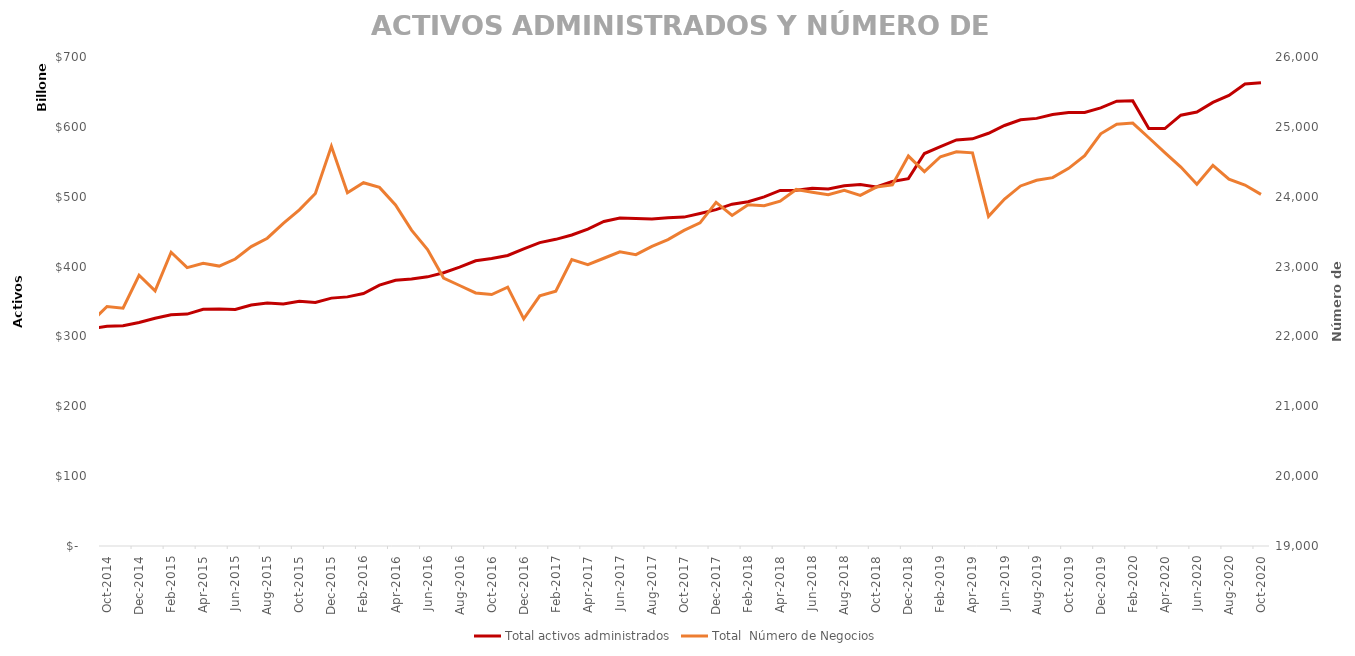
| Category | Total activos administrados |
|---|---|
| 2014-01-01 | 275831100.32 |
| 2014-02-01 | 282540287.38 |
| 2014-03-01 | 293725410.34 |
| 2014-04-01 | 297083130.06 |
| 2014-05-01 | 299989040.55 |
| 2014-06-01 | 299856845.58 |
| 2014-07-01 | 304100994.88 |
| 2014-08-01 | 315107203.45 |
| 2014-09-01 | 310941517.35 |
| 2014-10-01 | 314517386.46 |
| 2014-11-01 | 315319470.57 |
| 2014-12-01 | 320028520.24 |
| 2015-01-01 | 326117158.47 |
| 2015-02-01 | 331144520.36 |
| 2015-03-01 | 331981172.805 |
| 2015-04-01 | 338926238.767 |
| 2015-05-01 | 339240079.978 |
| 2015-06-01 | 338507344.528 |
| 2015-07-01 | 344906623.679 |
| 2015-08-01 | 347934876.102 |
| 2015-09-01 | 346437581.721 |
| 2015-10-01 | 350288175.716 |
| 2015-11-01 | 348695859.246 |
| 2015-12-01 | 354836337.141 |
| 2016-01-01 | 356608868.945 |
| 2016-02-01 | 361371487.01 |
| 2016-03-01 | 373359908.982 |
| 2016-04-01 | 380293748.088 |
| 2016-05-01 | 382057296.776 |
| 2016-06-01 | 385284005.51 |
| 2016-07-01 | 391162222.786 |
| 2016-08-01 | 399100246.403 |
| 2016-09-01 | 408243528.619 |
| 2016-10-01 | 411681112.939 |
| 2016-11-01 | 415877569.787 |
| 2016-12-01 | 425216779.143 |
| 2017-01-01 | 434258404.05 |
| 2017-02-01 | 438987856.756 |
| 2017-03-01 | 445157660.961 |
| 2017-04-01 | 453702785.873 |
| 2017-05-01 | 464497841.829 |
| 2017-06-01 | 469415788.649 |
| 2017-07-01 | 468962799.85 |
| 2017-08-01 | 468143792.161 |
| 2017-09-01 | 469727845.072 |
| 2017-10-01 | 470813763.716 |
| 2017-11-01 | 476084556.132 |
| 2017-12-01 | 481507641 |
| 2018-01-01 | 489352745 |
| 2018-02-01 | 492886628.093 |
| 2018-03-01 | 499799870.286 |
| 2018-04-01 | 509038822.941 |
| 2018-05-01 | 509341122.338 |
| 2018-06-01 | 512175223.444 |
| 2018-07-01 | 511213443.142 |
| 2018-08-01 | 515588338.106 |
| 2018-09-01 | 517468154.4 |
| 2018-10-01 | 513959839.346 |
| 2018-11-01 | 521784789.471 |
| 2018-12-01 | 525928025.494 |
| 2019-01-01 | 561800639.859 |
| 2019-02-01 | 571578939.256 |
| 2019-03-01 | 581325145.256 |
| 2019-04-01 | 582838730.822 |
| 2019-05-01 | 590827846.86 |
| 2019-06-01 | 601936170.817 |
| 2019-07-01 | 610096294.565 |
| 2019-08-01 | 612140239.027 |
| 2019-09-01 | 617592572.435 |
| 2019-10-01 | 620638755.372 |
| 2019-11-01 | 620586121.495 |
| 2019-12-01 | 627250437.809 |
| 2020-01-01 | 636706668.633 |
| 2020-02-01 | 637198516.488 |
| 2020-03-01 | 597723884.646 |
| 2020-04-01 | 597600675.349 |
| 2020-05-01 | 616751030.203 |
| 2020-06-01 | 621198055.701 |
| 2020-07-01 | 635091274.008 |
| 2020-08-01 | 645093768.784 |
| 2020-09-01 | 661306941.69 |
| 2020-10-01 | 663299299.526 |